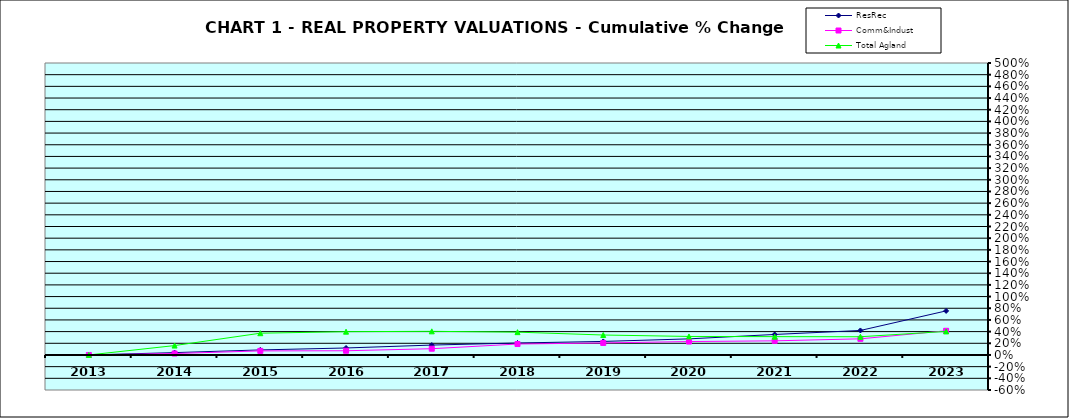
| Category | ResRec | Comm&Indust | Total Agland |
|---|---|---|---|
| 2013.0 | 0 | 0 | 0 |
| 2014.0 | 0.04 | 0.024 | 0.161 |
| 2015.0 | 0.086 | 0.07 | 0.373 |
| 2016.0 | 0.12 | 0.072 | 0.399 |
| 2017.0 | 0.17 | 0.107 | 0.405 |
| 2018.0 | 0.205 | 0.187 | 0.391 |
| 2019.0 | 0.232 | 0.206 | 0.342 |
| 2020.0 | 0.276 | 0.23 | 0.317 |
| 2021.0 | 0.351 | 0.242 | 0.314 |
| 2022.0 | 0.42 | 0.276 | 0.312 |
| 2023.0 | 0.755 | 0.414 | 0.403 |